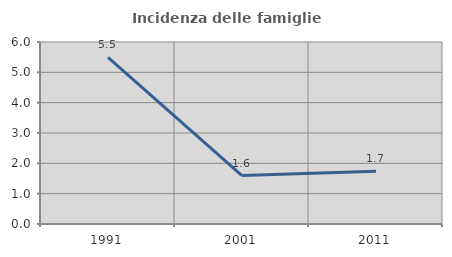
| Category | Incidenza delle famiglie numerose |
|---|---|
| 1991.0 | 5.491 |
| 2001.0 | 1.596 |
| 2011.0 | 1.737 |